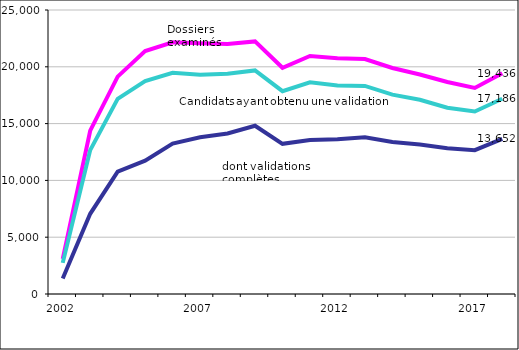
| Category | Nombre de dossiers examinés (décisions rendues) | Candidats ayant obtenu une validation, même partielle | Validations totales |
|---|---|---|---|
| 2002.0 | 3089 | 2740 | 1360 |
| 2003.0 | 14374 | 12666 | 7061 |
| 2004.0 | 19136 | 17181 | 10778 |
| 2005.0 | 21379 | 18734 | 11736 |
| 2006.0 | 22160 | 19477 | 13244 |
| 2007.0 | 22073 | 19300 | 13800 |
| 2008.0 | 22013 | 19384 | 14127 |
| 2009.0 | 22234 | 19679 | 14813 |
| 2010.0 | 19914 | 17855 | 13220 |
| 2011.0 | 20950 | 18640 | 13560 |
| 2012.0 | 20762 | 18360 | 13628 |
| 2013.0 | 20682 | 18317 | 13805 |
| 2014.0 | 19893 | 17547 | 13378 |
| 2015.0 | 19324 | 17099 | 13153 |
| 2016.0 | 18660 | 16401 | 12836 |
| 2017.0 | 18135 | 16060 | 12657 |
| 2018.0 | 19436 | 17186 | 13652 |